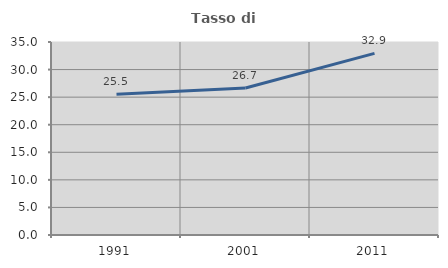
| Category | Tasso di occupazione   |
|---|---|
| 1991.0 | 25.514 |
| 2001.0 | 26.668 |
| 2011.0 | 32.939 |